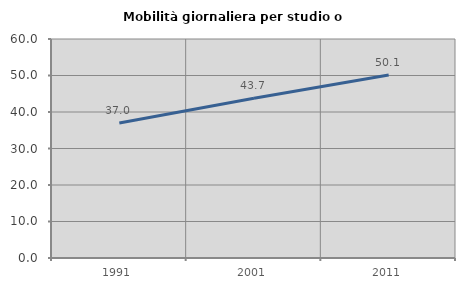
| Category | Mobilità giornaliera per studio o lavoro |
|---|---|
| 1991.0 | 37.007 |
| 2001.0 | 43.742 |
| 2011.0 | 50.12 |